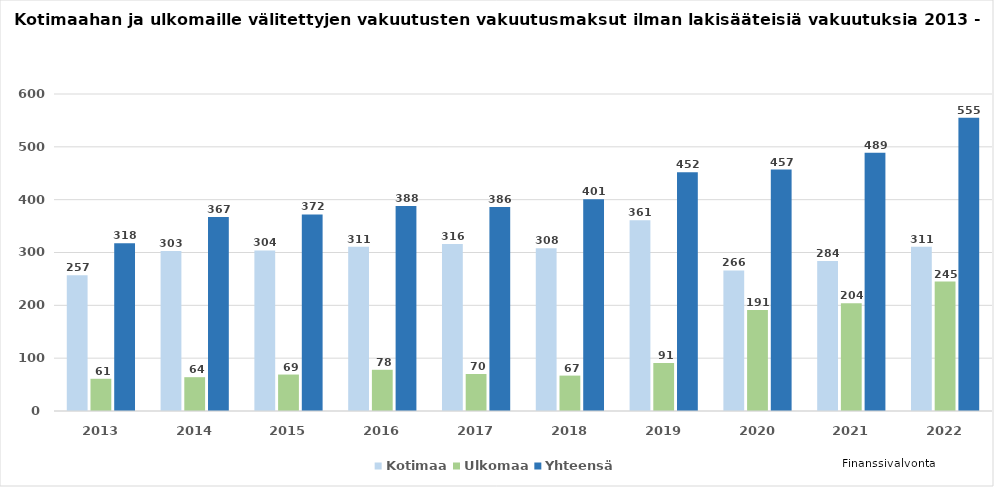
| Category | Kotimaa | Ulkomaa | Yhteensä  |
|---|---|---|---|
| 2013.0 | 257 | 61 | 317.523 |
| 2014.0 | 303 | 64 | 367 |
| 2015.0 | 304 | 69 | 372 |
| 2016.0 | 311 | 78 | 388 |
| 2017.0 | 316 | 70 | 386 |
| 2018.0 | 308 | 67 | 401 |
| 2019.0 | 361 | 91 | 452 |
| 2020.0 | 266 | 191 | 457 |
| 2021.0 | 284 | 204 | 489 |
| 2022.0 | 311 | 245 | 555 |